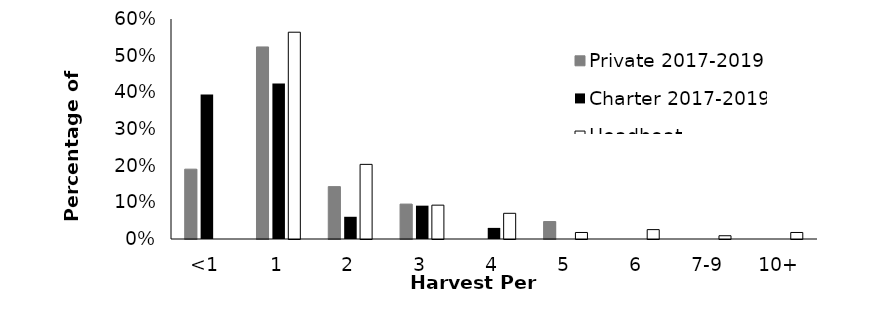
| Category | Private 2017-2019 | Charter 2017-2019 | Headboat 2017-2019 |
|---|---|---|---|
| <1 | 0.19 | 0.394 | 0 |
| 1 | 0.524 | 0.424 | 0.564 |
| 2 | 0.143 | 0.061 | 0.204 |
| 3 | 0.095 | 0.091 | 0.092 |
| 4 | 0 | 0.03 | 0.07 |
| 5 | 0.048 | 0 | 0.018 |
| 6 | 0 | 0 | 0.026 |
| 7-9 | 0 | 0 | 0.009 |
| 10+ | 0 | 0 | 0.018 |